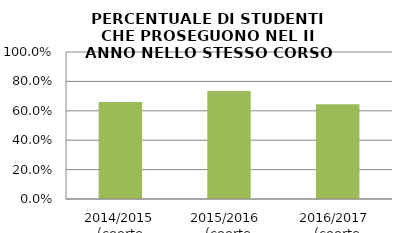
| Category | 2014/2015 (coorte 2013/14) 2015/2016  (coorte 2014/15) 2016/2017  (coorte 2015/16) |
|---|---|
| 2014/2015 (coorte 2013/14) | 0.659 |
| 2015/2016  (coorte 2014/15) | 0.734 |
| 2016/2017  (coorte 2015/16) | 0.645 |